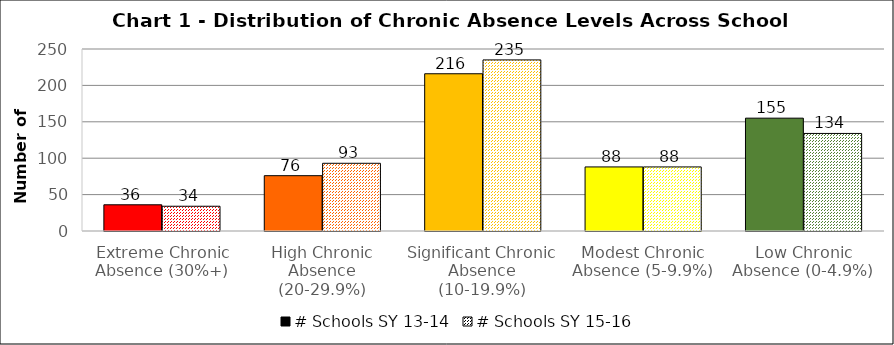
| Category | # Schools SY 13-14 | # Schools SY 15-16 |
|---|---|---|
| Extreme Chronic Absence (30%+) | 36 | 34 |
| High Chronic Absence (20-29.9%) | 76 | 93 |
| Significant Chronic Absence (10-19.9%) | 216 | 235 |
| Modest Chronic Absence (5-9.9%) | 88 | 88 |
| Low Chronic Absence (0-4.9%) | 155 | 134 |